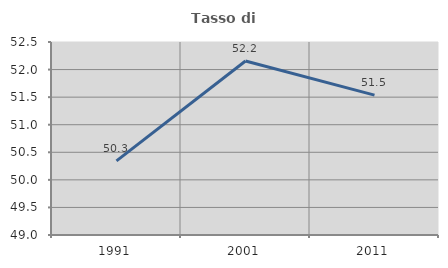
| Category | Tasso di occupazione   |
|---|---|
| 1991.0 | 50.343 |
| 2001.0 | 52.156 |
| 2011.0 | 51.536 |